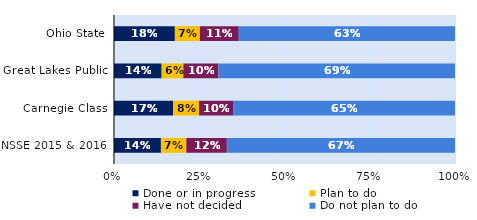
| Category | Done or in progress | Plan to do | Have not decided | Do not plan to do |
|---|---|---|---|---|
| Ohio State | 0.178 | 0.073 | 0.114 | 0.634 |
| Great Lakes Public | 0.14 | 0.064 | 0.103 | 0.694 |
| Carnegie Class | 0.173 | 0.076 | 0.1 | 0.651 |
| NSSE 2015 & 2016 | 0.138 | 0.075 | 0.119 | 0.669 |